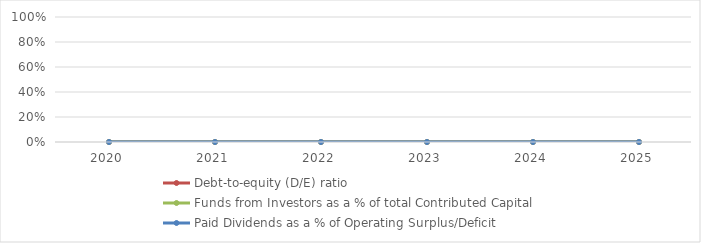
| Category | Debt-to-equity (D/E) ratio | Funds from Investors as a % of total Contributed Capital | Paid Dividends as a % of Operating Surplus/Deficit |
|---|---|---|---|
| 2020.0 | 0 | 0 | 0 |
| 2021.0 | 0 | 0 | 0 |
| 2022.0 | 0 | 0 | 0 |
| 2023.0 | 0 | 0 | 0 |
| 2024.0 | 0 | 0 | 0 |
| 2025.0 | 0 | 0 | 0 |